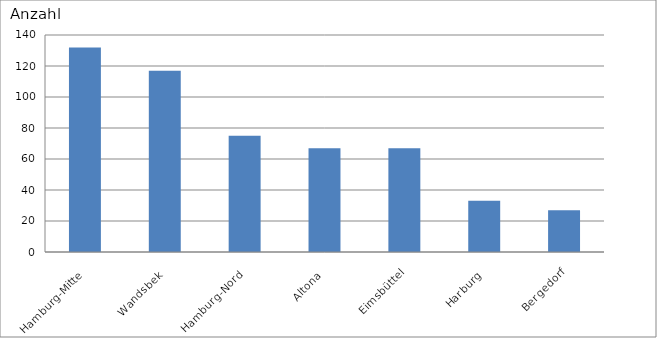
| Category | Hamburg-Mitte Wandsbek Hamburg-Nord Altona Eimsbüttel Harburg Bergedorf |
|---|---|
| Hamburg-Mitte | 132 |
| Wandsbek | 117 |
| Hamburg-Nord | 75 |
| Altona | 67 |
| Eimsbüttel | 67 |
| Harburg | 33 |
| Bergedorf | 27 |